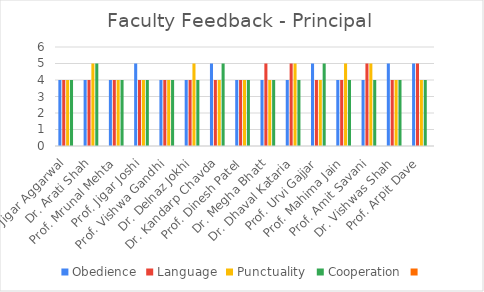
| Category | Obedience | Language | Punctuality  | Cooperation | Series 4 |
|---|---|---|---|---|---|
| Dr. Jigar Aggarwal | 4 | 4 | 4 | 4 |  |
| Dr. Arati Shah | 4 | 4 | 5 | 5 |  |
| Prof. Mrunal Mehta | 4 | 4 | 4 | 4 |  |
| Prof. Jigar Joshi | 5 | 4 | 4 | 4 |  |
| Prof. Vishwa Gandhi | 4 | 4 | 4 | 4 |  |
| Dr. Delnaz Jokhi | 4 | 4 | 5 | 4 |  |
| Dr. Kandarp Chavda | 5 | 4 | 4 | 5 |  |
| Prof. Dinesh Patel | 4 | 4 | 4 | 4 |  |
| Dr. Megha Bhatt | 4 | 5 | 4 | 4 |  |
| Dr. Dhaval Kataria | 4 | 5 | 5 | 4 |  |
| Prof. Urvi Gajjar | 5 | 4 | 4 | 5 |  |
| Prof. Mahima Jain | 4 | 4 | 5 | 4 |  |
| Prof. Amit Savani | 4 | 5 | 5 | 4 |  |
| Dr. Vishwas Shah | 5 | 4 | 4 | 4 |  |
| Prof. Arpit Dave | 5 | 5 | 4 | 4 |  |